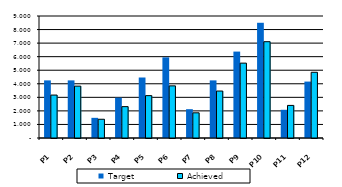
| Category | Target | Achieved  |
|---|---|---|
| P1 | 4250 | 3167 |
| P2 | 4250 | 3826 |
| P3 | 1487.5 | 1383 |
| P4 | 2975 | 2314 |
| P5 | 4462.5 | 3126 |
| P6 | 5950 | 3846 |
| P7 | 2125 | 1857 |
| P8 | 4250 | 3464 |
| P9 | 6375 | 5523 |
| P10 | 8500 | 7104 |
| P11 | 2081.25 | 2404 |
| P12 | 4162.5 | 4847 |